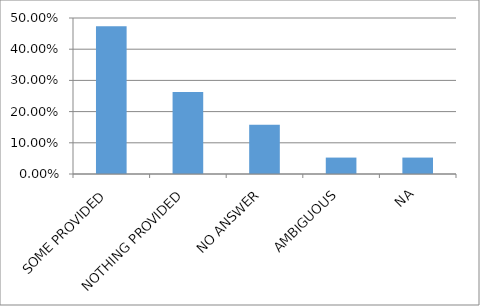
| Category | Series 0 |
|---|---|
| SOME PROVIDED | 0.474 |
| NOTHING PROVIDED | 0.263 |
| NO ANSWER | 0.158 |
| AMBIGUOUS | 0.053 |
| NA | 0.053 |